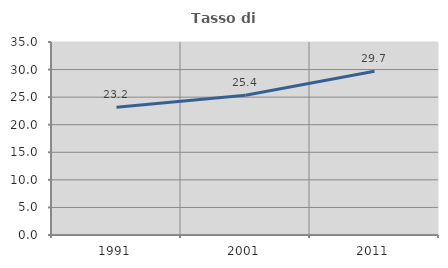
| Category | Tasso di occupazione   |
|---|---|
| 1991.0 | 23.179 |
| 2001.0 | 25.359 |
| 2011.0 | 29.687 |